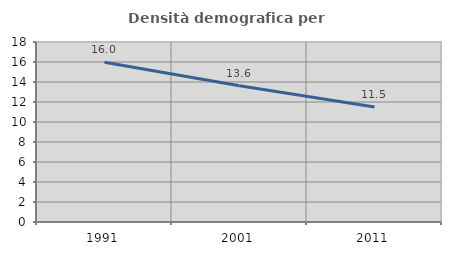
| Category | Densità demografica |
|---|---|
| 1991.0 | 15.977 |
| 2001.0 | 13.624 |
| 2011.0 | 11.49 |